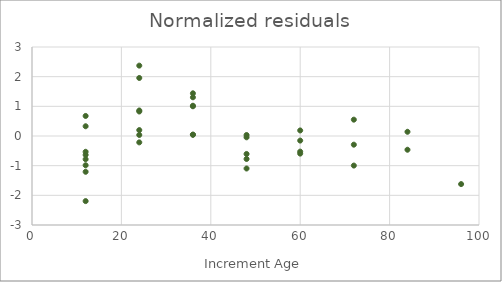
| Category | Normalized residuals |
|---|---|
| 12.0 | 0.328 |
| 24.0 | 0.199 |
| 36.0 | 0.044 |
| 48.0 | -0.606 |
| 60.0 | -0.154 |
| 72.0 | -0.997 |
| 84.0 | -0.463 |
| 96.0 | -1.621 |
| 12.0 | 0.676 |
| 24.0 | 2.372 |
| 36.0 | 0.044 |
| 48.0 | -0.044 |
| 60.0 | -0.594 |
| 72.0 | 0.551 |
| 84.0 | 0.142 |
| 12.0 | -0.637 |
| 24.0 | -0.215 |
| 36.0 | 1.002 |
| 48.0 | 0.034 |
| 60.0 | 0.187 |
| 72.0 | -0.292 |
| 12.0 | -0.783 |
| 24.0 | 0.035 |
| 36.0 | 1.305 |
| 48.0 | -0.775 |
| 60.0 | -0.526 |
| 12.0 | -2.194 |
| 24.0 | 0.86 |
| 36.0 | 1.439 |
| 48.0 | -1.096 |
| 12.0 | -1.206 |
| 24.0 | 1.956 |
| 36.0 | 1.02 |
| 12.0 | -0.532 |
| 24.0 | 0.826 |
| 12.0 | -0.987 |